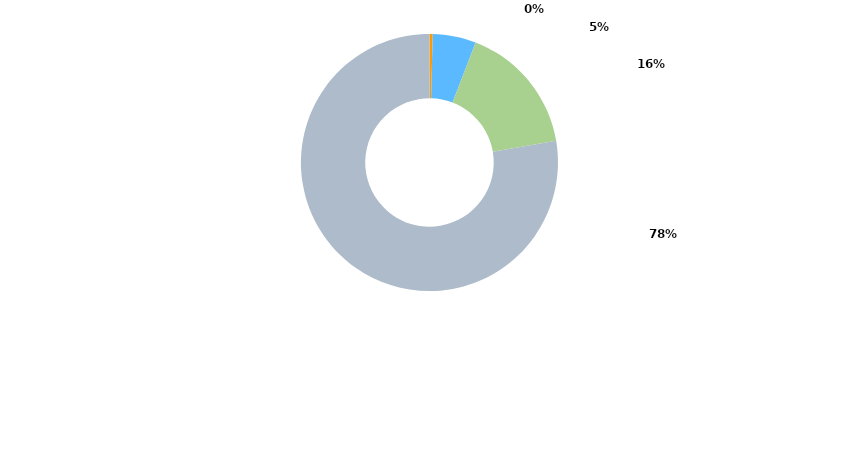
| Category | Series 0 |
|---|---|
| CENTRALIZADOS | 21280 |
| CONTRATOS MENORES | 291334.62 |
| ENCARGOS | 880573.03 |
| ABIERTOS | 4156618.99 |